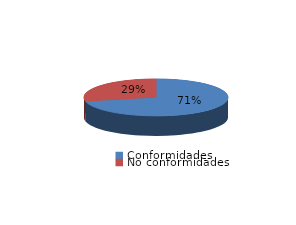
| Category | Series 0 |
|---|---|
| Conformidades | 9403 |
| No conformidades | 3770 |